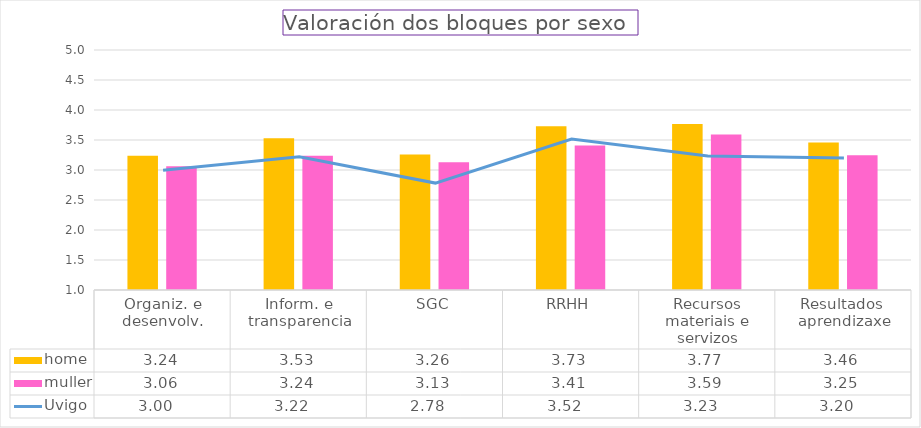
| Category | home  | muller |
|---|---|---|
| Organiz. e desenvolv. | 3.237 | 3.061 |
| Inform. e transparencia | 3.529 | 3.237 |
| SGC | 3.258 | 3.128 |
| RRHH | 3.73 | 3.408 |
| Recursos materiais e servizos | 3.767 | 3.592 |
| Resultados  aprendizaxe | 3.458 | 3.246 |